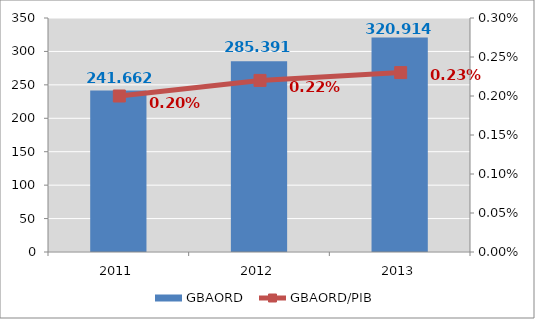
| Category | GBAORD  |
|---|---|
| 2011.0 | 241.662 |
| 2012.0 | 285.391 |
| 2013.0 | 320.914 |